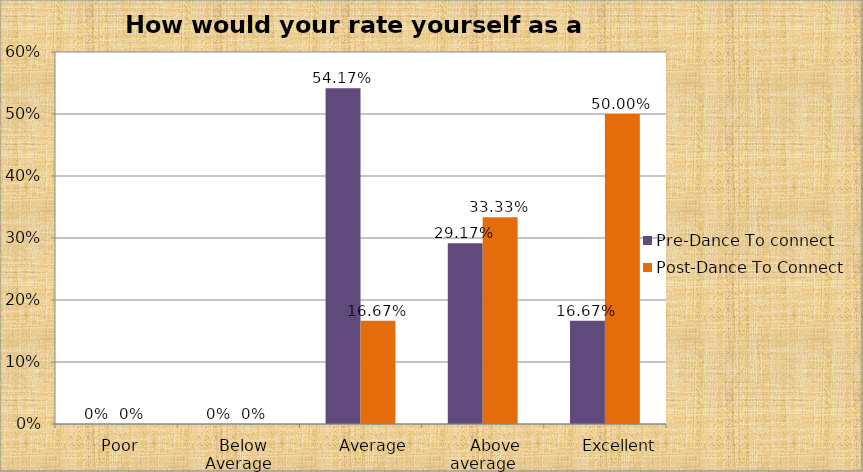
| Category | Pre-Dance To connect  | Post-Dance To Connect |
|---|---|---|
|   Poor | 0 | 0 |
|   Below Average | 0 | 0 |
|       Average | 0.542 | 0.167 |
|      Above average | 0.292 | 0.333 |
|        Excellent | 0.167 | 0.5 |